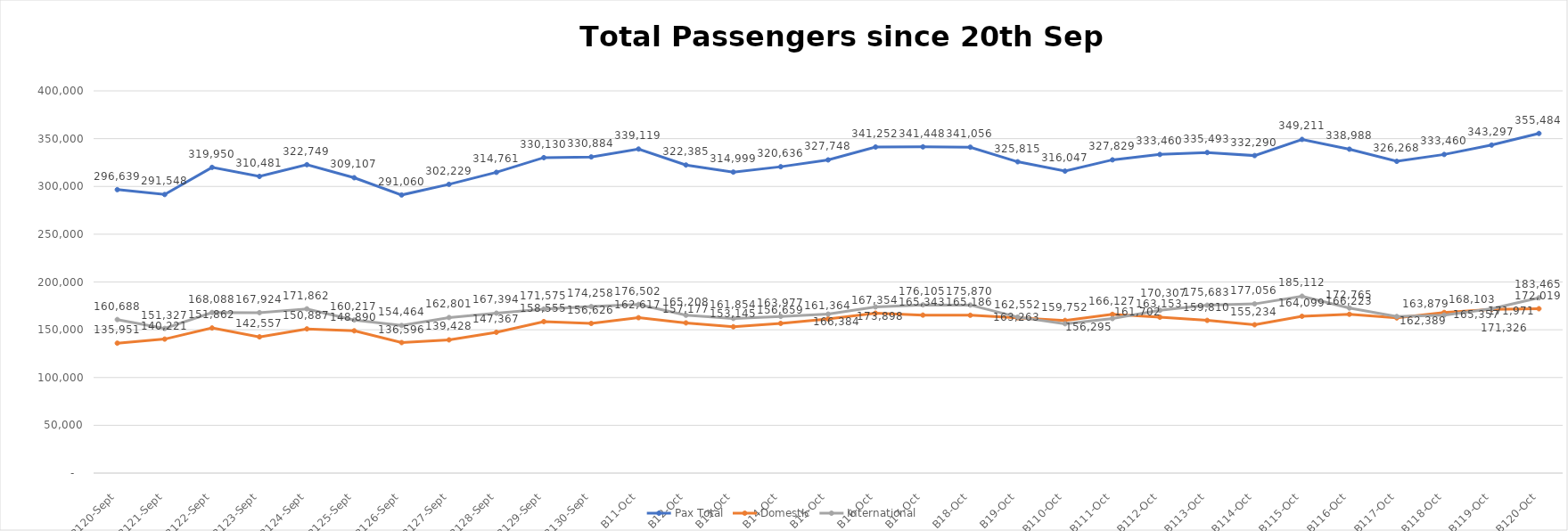
| Category | Pax Total | Domestic | International |
|---|---|---|---|
| 2023-09-20 | 296639 | 135951 | 160688 |
| 2023-09-21 | 291548 | 140221 | 151327 |
| 2023-09-22 | 319950 | 151862 | 168088 |
| 2023-09-23 | 310481 | 142557 | 167924 |
| 2023-09-24 | 322749 | 150887 | 171862 |
| 2023-09-25 | 309107 | 148890 | 160217 |
| 2023-09-26 | 291060 | 136596 | 154464 |
| 2023-09-27 | 302229 | 139428 | 162801 |
| 2023-09-28 | 314761 | 147367 | 167394 |
| 2023-09-29 | 330130 | 158555 | 171575 |
| 2023-09-30 | 330884 | 156626 | 174258 |
| 2023-10-01 | 339119 | 162617 | 176502 |
| 2023-10-02 | 322385 | 157177 | 165208 |
| 2023-10-03 | 314999 | 153145 | 161854 |
| 2023-10-04 | 320636 | 156659 | 163977 |
| 2023-10-05 | 327748 | 161364 | 166384 |
| 2023-10-06 | 341252 | 167354 | 173898 |
| 2023-10-07 | 341448 | 165343 | 176105 |
| 2023-10-08 | 341056 | 165186 | 175870 |
| 2023-10-09 | 325815 | 162552 | 163263 |
| 2023-10-10 | 316047 | 159752 | 156295 |
| 2023-10-11 | 327829 | 166127 | 161702 |
| 2023-10-12 | 333460 | 163153 | 170307 |
| 2023-10-13 | 335493 | 159810 | 175683 |
| 2023-10-14 | 332290 | 155234 | 177056 |
| 2023-10-15 | 349211 | 164099 | 185112 |
| 2023-10-16 | 338988 | 166223 | 172765 |
| 2023-10-17 | 326268 | 162389 | 163879 |
| 2023-10-18 | 333460 | 168103 | 165357 |
| 2023-10-19 | 343297 | 171326 | 171971 |
| 2023-10-20 | 355484 | 172019 | 183465 |